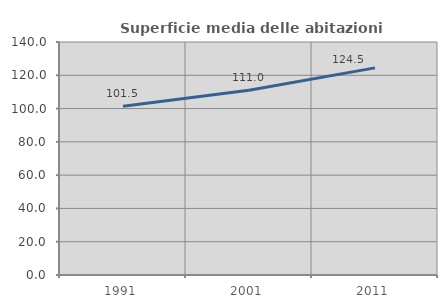
| Category | Superficie media delle abitazioni occupate |
|---|---|
| 1991.0 | 101.462 |
| 2001.0 | 110.988 |
| 2011.0 | 124.464 |